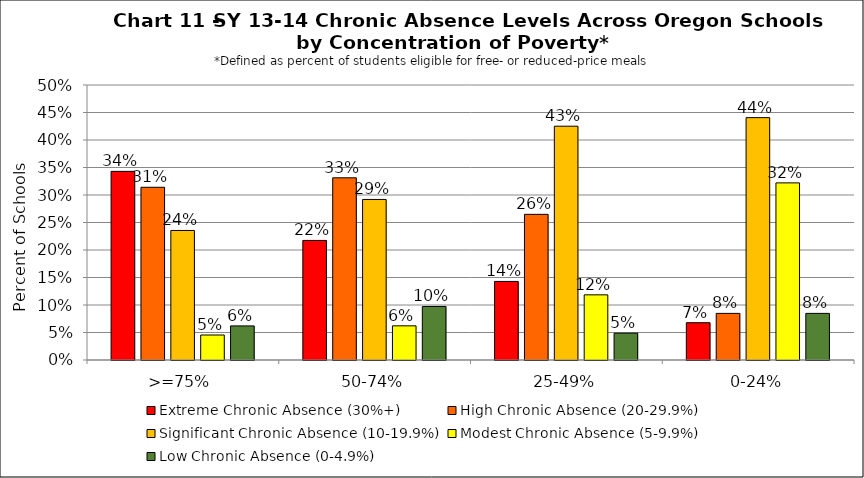
| Category | Extreme Chronic Absence (30%+) | High Chronic Absence (20-29.9%) | Significant Chronic Absence (10-19.9%) | Modest Chronic Absence (5-9.9%) | Low Chronic Absence (0-4.9%) |
|---|---|---|---|---|---|
| 0 | 0.343 | 0.314 | 0.236 | 0.045 | 0.062 |
| 1 | 0.217 | 0.331 | 0.292 | 0.062 | 0.097 |
| 2 | 0.143 | 0.265 | 0.425 | 0.118 | 0.049 |
| 3 | 0.068 | 0.085 | 0.441 | 0.322 | 0.085 |